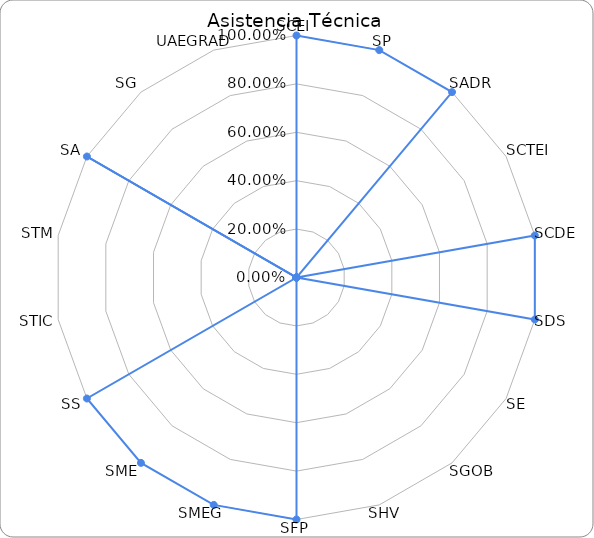
| Category | % Eficacia total |
|---|---|
| SCEI | 1 |
| SP | 1 |
| SADR | 1 |
| SCTEI | 0 |
| SCDE | 1 |
| SDS | 1 |
| SE | 0 |
| SGOB | 0 |
| SHV | 0 |
| SFP | 1 |
| SMEG | 1 |
| SME | 1 |
| SS | 1 |
| STIC | 0 |
| STM | 0 |
| SA | 1 |
| SG | 0 |
| UAEGRAD | 0 |